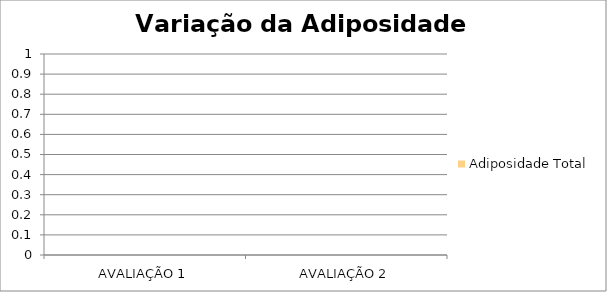
| Category | Adiposidade Total |
|---|---|
| AVALIAÇÃO 1 | 0 |
| AVALIAÇÃO 2 | 0 |